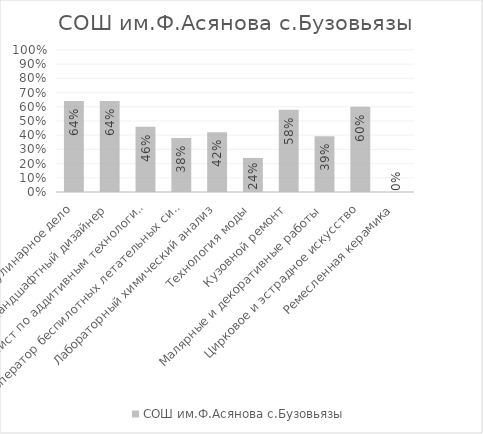
| Category | СОШ им.Ф.Асянова с.Бузовьязы |
|---|---|
| Кулинарное дело | 0.64 |
| Ландшафтный дизайнер | 0.64 |
| Специалист по аддитивным технологиям | 0.46 |
| Оператор беспилотных летательных систем | 0.38 |
| Лабораторный химический анализ | 0.42 |
| Технология моды | 0.24 |
| Кузовной ремонт | 0.58 |
| Малярные и декоративные работы | 0.393 |
| Цирковое и эстрадное искусство | 0.6 |
| Ремесленная керамика | 0 |